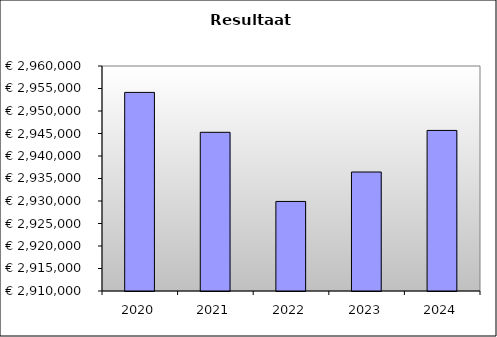
| Category | Series 0 |
|---|---|
| 2020.0 | 2954134.437 |
| 2021.0 | 2945267.171 |
| 2022.0 | 2929901.207 |
| 2023.0 | 2936442.177 |
| 2024.0 | 2945682.347 |